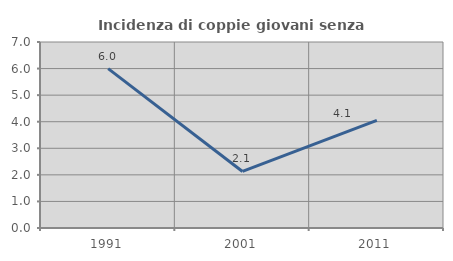
| Category | Incidenza di coppie giovani senza figli |
|---|---|
| 1991.0 | 6 |
| 2001.0 | 2.128 |
| 2011.0 | 4.054 |